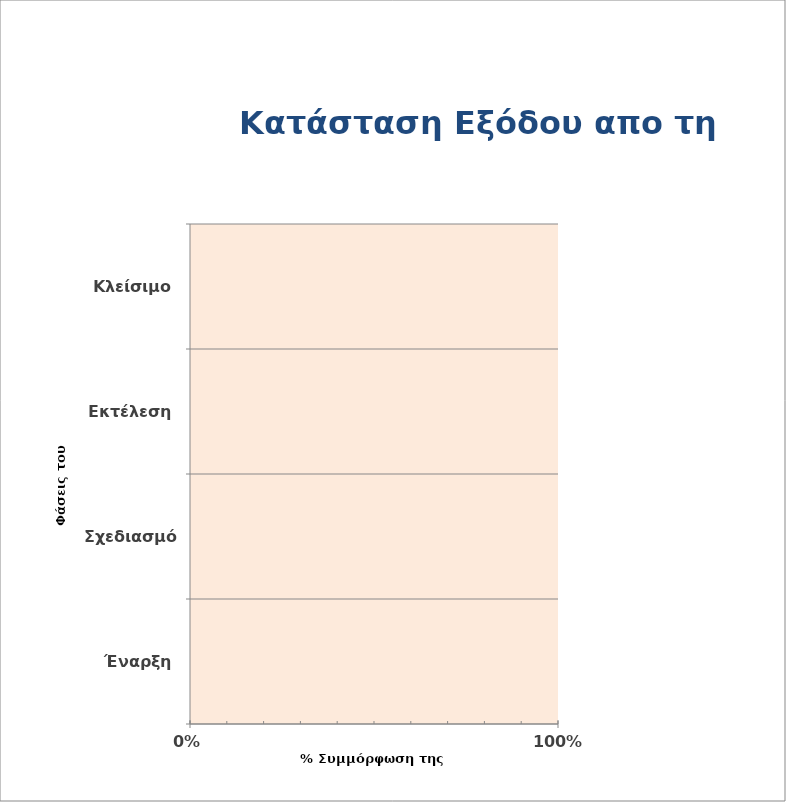
| Category | % of phase completion |
|---|---|
| Έναρξη | 0 |
| Σχεδιασμός | 0 |
| Εκτέλεση | 0 |
| Κλείσιμο | 0 |